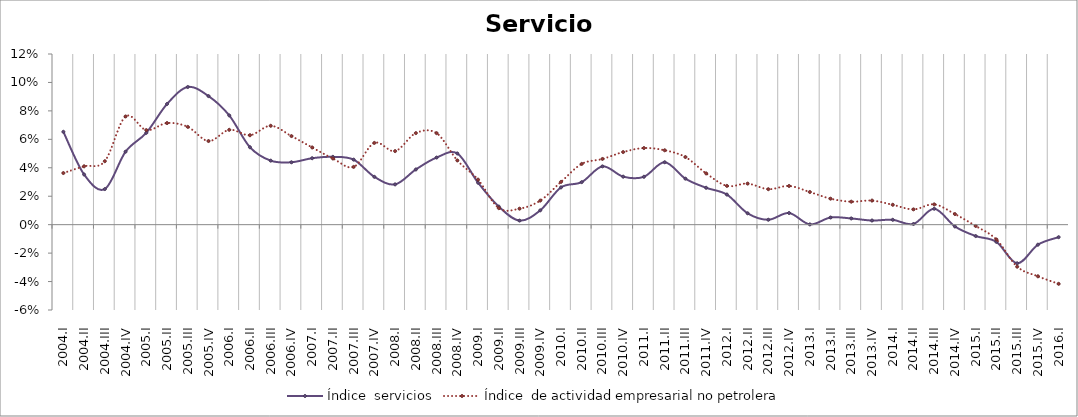
| Category | Índice  servicios | Índice  de actividad empresarial no petrolera |
|---|---|---|
| 2004.I | 0.065 | 0.036 |
| 2004.II | 0.035 | 0.041 |
| 2004.III | 0.025 | 0.045 |
| 2004.IV | 0.051 | 0.076 |
| 2005.I | 0.065 | 0.066 |
| 2005.II | 0.085 | 0.071 |
| 2005.III | 0.097 | 0.069 |
| 2005.IV | 0.09 | 0.059 |
| 2006.I | 0.077 | 0.067 |
| 2006.II | 0.054 | 0.063 |
| 2006.III | 0.045 | 0.07 |
| 2006.IV | 0.044 | 0.062 |
| 2007.I | 0.047 | 0.054 |
| 2007.II | 0.048 | 0.047 |
| 2007.III | 0.046 | 0.041 |
| 2007.IV | 0.034 | 0.057 |
| 2008.I | 0.028 | 0.052 |
| 2008.II | 0.039 | 0.064 |
| 2008.III | 0.047 | 0.064 |
| 2008.IV | 0.05 | 0.045 |
| 2009.I | 0.03 | 0.032 |
| 2009.II | 0.013 | 0.012 |
| 2009.III | 0.003 | 0.011 |
| 2009.IV | 0.01 | 0.017 |
| 2010.I | 0.026 | 0.03 |
| 2010.II | 0.03 | 0.043 |
| 2010.III | 0.041 | 0.046 |
| 2010.IV | 0.034 | 0.051 |
| 2011.I | 0.034 | 0.054 |
| 2011.II | 0.044 | 0.052 |
| 2011.III | 0.032 | 0.048 |
| 2011.IV | 0.026 | 0.036 |
| 2012.I | 0.021 | 0.027 |
| 2012.II | 0.008 | 0.029 |
| 2012.III | 0.003 | 0.025 |
| 2012.IV | 0.008 | 0.027 |
| 2013.I | 0 | 0.023 |
| 2013.II | 0.005 | 0.018 |
| 2013.III | 0.004 | 0.016 |
| 2013.IV | 0.003 | 0.017 |
| 2014.I | 0.003 | 0.014 |
| 2014.II | 0 | 0.011 |
| 2014.III | 0.011 | 0.014 |
| 2014.IV | -0.001 | 0.007 |
| 2015.I | -0.008 | -0.001 |
| 2015.II | -0.012 | -0.01 |
| 2015.III | -0.027 | -0.03 |
| 2015.IV | -0.014 | -0.036 |
| 2016.I | -0.009 | -0.042 |